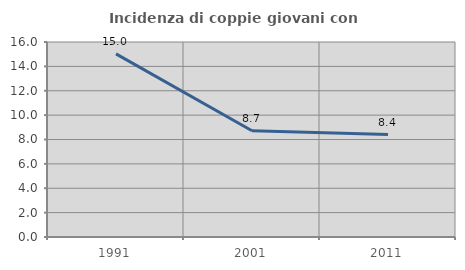
| Category | Incidenza di coppie giovani con figli |
|---|---|
| 1991.0 | 15.025 |
| 2001.0 | 8.718 |
| 2011.0 | 8.403 |